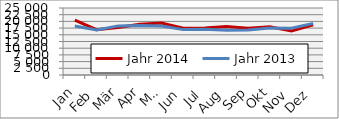
| Category | Jahr 2014 | Jahr 2013 |
|---|---|---|
| Jan | 20511.518 | 18280.973 |
| Feb | 16930.516 | 16822.816 |
| Mär | 17709.604 | 18327.504 |
| Apr | 18952.005 | 18456.027 |
| Mai | 19397.52 | 18252.612 |
| Jun | 17485.14 | 16936.675 |
| Jul | 17501.553 | 17058.096 |
| Aug | 18124.953 | 16663.423 |
| Sep | 17487.606 | 16760.328 |
| Okt | 17963.811 | 17509.794 |
| Nov | 16437.987 | 17461.267 |
| Dez | 18734.205 | 19270.485 |